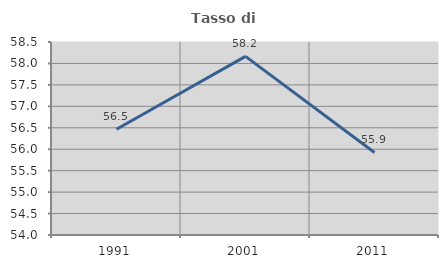
| Category | Tasso di occupazione   |
|---|---|
| 1991.0 | 56.464 |
| 2001.0 | 58.165 |
| 2011.0 | 55.924 |